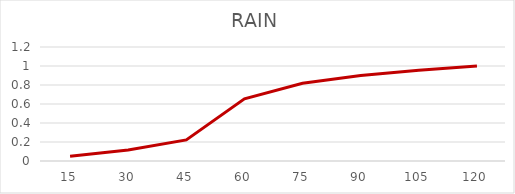
| Category | RAIN |
|---|---|
| 15.0 | 0.05 |
| 30.0 | 0.116 |
| 45.0 | 0.222 |
| 60.0 | 0.655 |
| 75.0 | 0.818 |
| 90.0 | 0.899 |
| 105.0 | 0.955 |
| 120.0 | 1 |